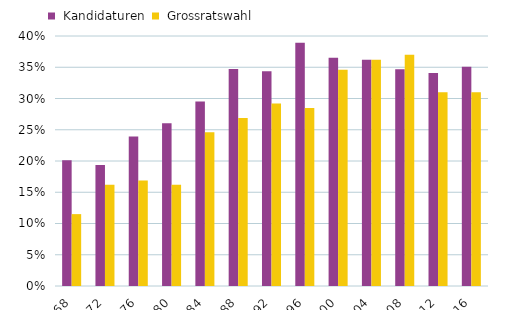
| Category |  Kandidaturen |  Grossratswahl |
|---|---|---|
| 1968 | 0.201 | 0.115 |
| 1972 | 0.194 | 0.162 |
| 1976 | 0.239 | 0.169 |
| 1980 | 0.261 | 0.162 |
| 1984 | 0.295 | 0.246 |
| 1988 | 0.347 | 0.269 |
| 1992 | 0.344 | 0.292 |
| 1996 | 0.389 | 0.285 |
| 2000 | 0.365 | 0.346 |
| 2004 | 0.362 | 0.362 |
| 2008 | 0.347 | 0.37 |
| 2012 | 0.341 | 0.31 |
| 2016 | 0.351 | 0.31 |